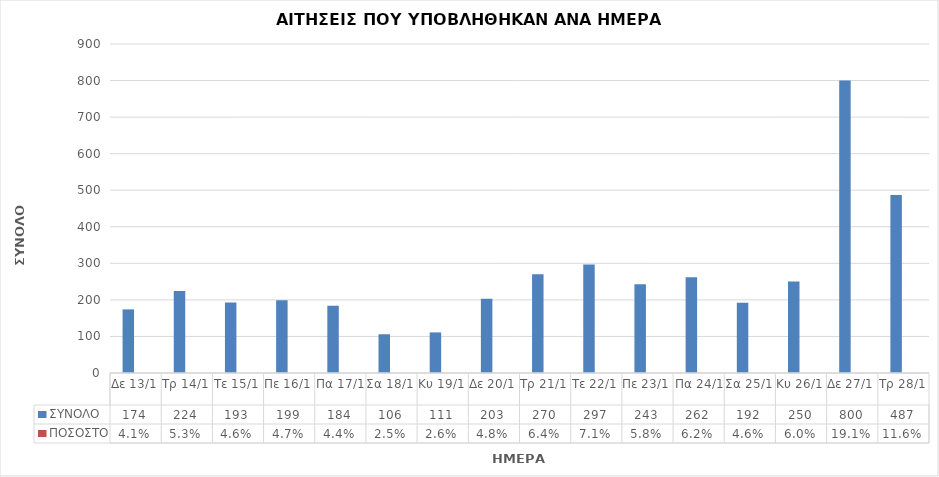
| Category | ΣΥΝΟΛΟ | ΠΟΣΟΣΤΟ |
|---|---|---|
| Δε 13/1 | 174 | 0.041 |
| Τρ 14/1 | 224 | 0.053 |
| Τε 15/1 | 193 | 0.046 |
| Πε 16/1 | 199 | 0.047 |
| Πα 17/1 | 184 | 0.044 |
| Σα 18/1 | 106 | 0.025 |
| Κυ 19/1 | 111 | 0.026 |
| Δε 20/1 | 203 | 0.048 |
| Τρ 21/1 | 270 | 0.064 |
| Τε 22/1 | 297 | 0.071 |
| Πε 23/1 | 243 | 0.058 |
| Πα 24/1 | 262 | 0.062 |
| Σα 25/1 | 192 | 0.046 |
| Κυ 26/1 | 250 | 0.06 |
| Δε 27/1 | 800 | 0.191 |
| Τρ 28/1 | 487 | 0.116 |